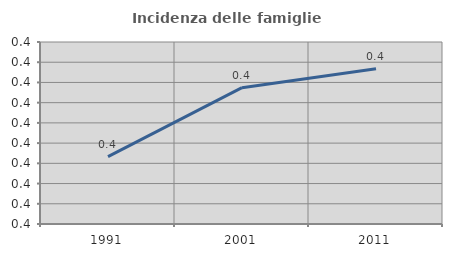
| Category | Incidenza delle famiglie numerose |
|---|---|
| 1991.0 | 0.377 |
| 2001.0 | 0.394 |
| 2011.0 | 0.398 |